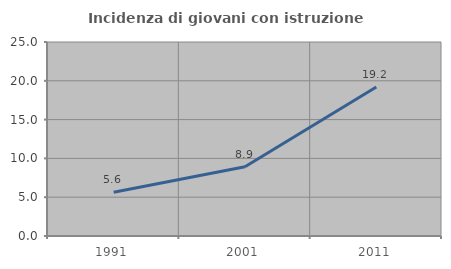
| Category | Incidenza di giovani con istruzione universitaria |
|---|---|
| 1991.0 | 5.625 |
| 2001.0 | 8.934 |
| 2011.0 | 19.203 |